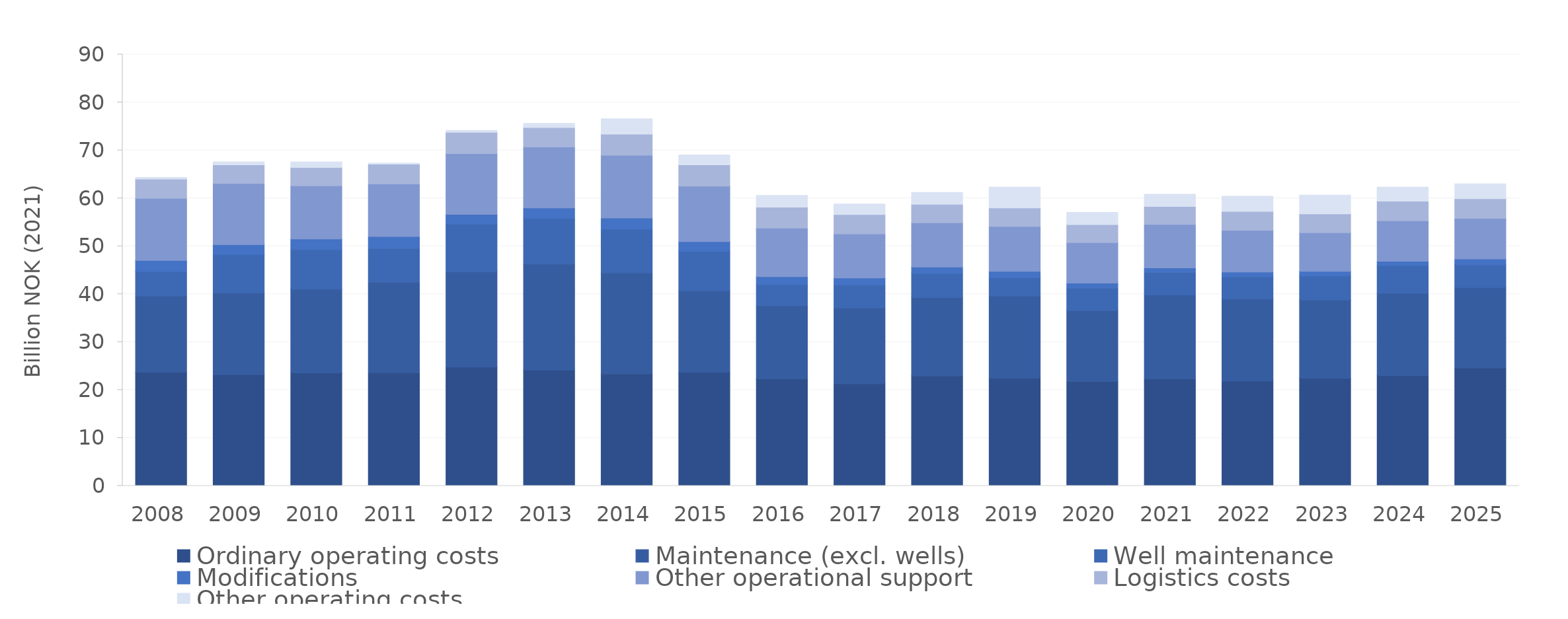
| Category | Ordinary operating costs | Maintenance (excl. wells) | Well maintenance | Modifications  | Other operational support  | Logistics costs | Other operating costs |
|---|---|---|---|---|---|---|---|
| 2008.0 | 23.717 | 15.878 | 5.104 | 2.341 | 12.949 | 4.041 | 0.344 |
| 2009.0 | 23.226 | 17.006 | 8.031 | 2.067 | 12.763 | 3.879 | 0.641 |
| 2010.0 | 23.578 | 17.472 | 8.246 | 2.226 | 11.084 | 3.832 | 1.183 |
| 2011.0 | 23.616 | 18.876 | 7.058 | 2.492 | 10.952 | 4.139 | 0.207 |
| 2012.0 | 24.818 | 19.88 | 9.902 | 2.063 | 12.662 | 4.449 | 0.402 |
| 2013.0 | 24.142 | 22.126 | 9.502 | 2.233 | 12.709 | 4.057 | 0.861 |
| 2014.0 | 23.37 | 21.077 | 9.096 | 2.334 | 13.106 | 4.396 | 3.21 |
| 2015.0 | 23.708 | 16.996 | 8.21 | 2.046 | 11.564 | 4.45 | 2.083 |
| 2016.0 | 22.323 | 15.256 | 4.414 | 1.654 | 10.151 | 4.372 | 2.45 |
| 2017.0 | 21.343 | 15.782 | 4.788 | 1.484 | 9.183 | 4.022 | 2.207 |
| 2018.0 | 22.942 | 16.321 | 5.026 | 1.379 | 9.212 | 3.858 | 2.489 |
| 2019.0 | 22.435 | 17.142 | 3.848 | 1.343 | 9.351 | 3.887 | 4.342 |
| 2020.0 | 21.794 | 14.793 | 4.651 | 1.074 | 8.438 | 3.758 | 2.546 |
| 2021.0 | 22.317 | 17.5 | 4.745 | 0.916 | 9.073 | 3.757 | 2.538 |
| 2022.0 | 21.868 | 17.133 | 4.619 | 0.99 | 8.709 | 3.96 | 3.155 |
| 2023.0 | 22.445 | 16.34 | 5.019 | 0.944 | 8.061 | 3.938 | 3.915 |
| 2024.0 | 23.005 | 17.167 | 5.745 | 0.956 | 8.415 | 4.114 | 2.946 |
| 2025.0 | 24.552 | 16.819 | 4.718 | 1.259 | 8.457 | 4.101 | 3.106 |